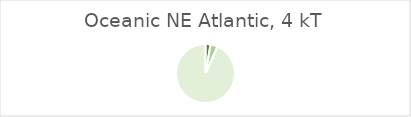
| Category | Oceanic NE Atlantic |
|---|---|
| Landings of assessed stocks for which adequate information is available to determine GES for F and/or SSB | 103.92 |
| Landings of assessed stocks for which insufficient information is available to determine GES for F and/or SSB | 147.25 |
| Landings unassessed stocks | 3539.18 |